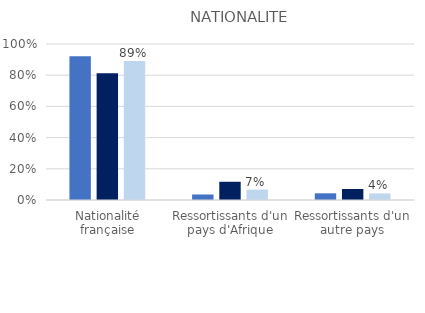
| Category | Ensemble de la population | Ensemble des mis en cause | Mis en cause pour crime ou délit à caractère raciste, xénophobe ou antireligieux |
|---|---|---|---|
| Nationalité française | 0.922 | 0.813 | 0.891 |
| Ressortissants d'un pays d'Afrique | 0.035 | 0.117 | 0.067 |
| Ressortissants d'un autre pays | 0.043 | 0.071 | 0.042 |